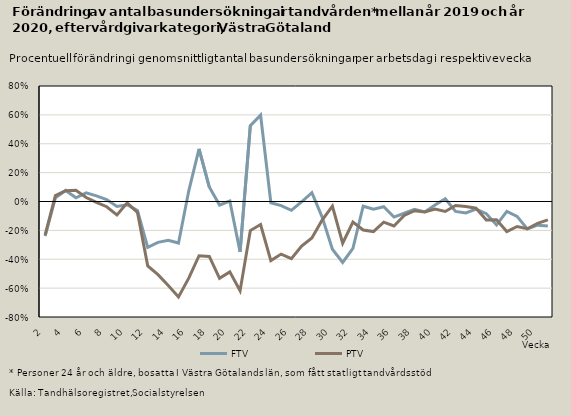
| Category | FTV | PTV |
|---|---|---|
| 2.0 | -0.24 | -0.231 |
| 3.0 | 0.026 | 0.041 |
| 4.0 | 0.077 | 0.075 |
| 5.0 | 0.026 | 0.078 |
| 6.0 | 0.06 | 0.028 |
| 7.0 | 0.039 | -0.006 |
| 8.0 | 0.013 | -0.036 |
| 9.0 | -0.034 | -0.093 |
| 10.0 | -0.023 | -0.009 |
| 11.0 | -0.063 | -0.076 |
| 12.0 | -0.318 | -0.446 |
| 13.0 | -0.283 | -0.507 |
| 14.0 | -0.269 | -0.581 |
| 15.0 | -0.288 | -0.661 |
| 16.0 | 0.074 | -0.531 |
| 17.0 | 0.365 | -0.376 |
| 18.0 | 0.1 | -0.381 |
| 19.0 | -0.024 | -0.532 |
| 20.0 | 0.003 | -0.488 |
| 21.0 | -0.349 | -0.619 |
| 22.0 | 0.526 | -0.201 |
| 23.0 | 0.598 | -0.159 |
| 24.0 | -0.009 | -0.409 |
| 25.0 | -0.028 | -0.364 |
| 26.0 | -0.061 | -0.396 |
| 27.0 | -0.002 | -0.308 |
| 28.0 | 0.061 | -0.252 |
| 29.0 | -0.108 | -0.129 |
| 30.0 | -0.331 | -0.031 |
| 31.0 | -0.422 | -0.289 |
| 32.0 | -0.324 | -0.143 |
| 33.0 | -0.033 | -0.198 |
| 34.0 | -0.054 | -0.208 |
| 35.0 | -0.036 | -0.143 |
| 36.0 | -0.108 | -0.17 |
| 37.0 | -0.081 | -0.097 |
| 38.0 | -0.054 | -0.064 |
| 39.0 | -0.073 | -0.072 |
| 40.0 | -0.024 | -0.052 |
| 41.0 | 0.019 | -0.069 |
| 42.0 | -0.069 | -0.027 |
| 43.0 | -0.08 | -0.035 |
| 44.0 | -0.052 | -0.046 |
| 45.0 | -0.085 | -0.128 |
| 46.0 | -0.162 | -0.127 |
| 47.0 | -0.068 | -0.208 |
| 48.0 | -0.103 | -0.173 |
| 49.0 | -0.191 | -0.188 |
| 50.0 | -0.164 | -0.151 |
| 51.0 | -0.17 | -0.127 |